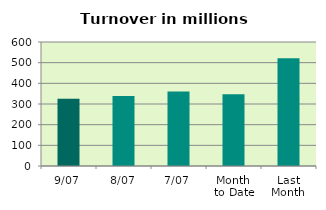
| Category | Series 0 |
|---|---|
| 9/07 | 324.911 |
| 8/07 | 338.811 |
| 7/07 | 360.427 |
| Month 
to Date | 347.162 |
| Last
Month | 521.023 |